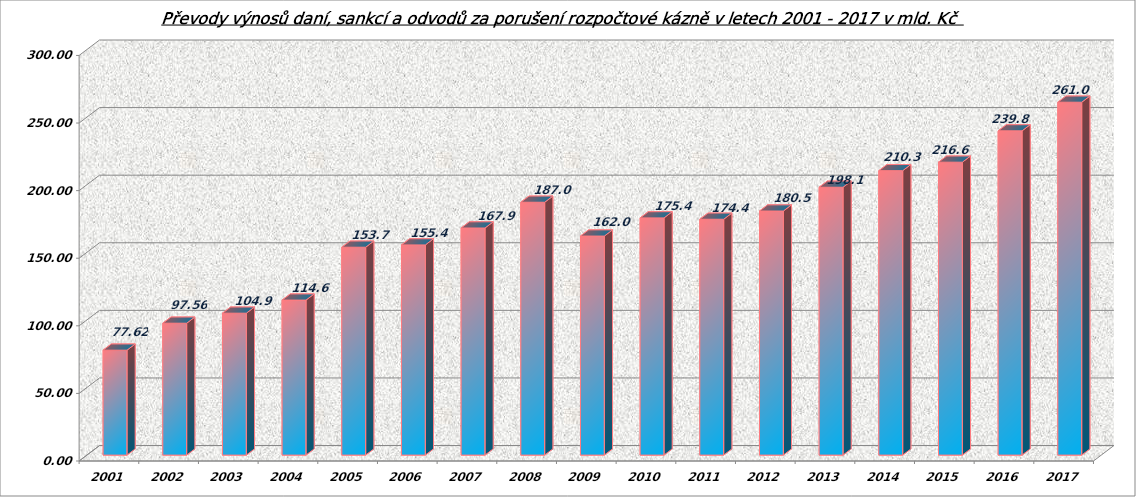
| Category | Series 0 |
|---|---|
| 2001.0 | 77.62 |
| 2002.0 | 97.559 |
| 2003.0 | 104.974 |
| 2004.0 | 114.659 |
| 2005.0 | 153.772 |
| 2006.0 | 155.476 |
| 2007.0 | 167.992 |
| 2008.0 | 187.032 |
| 2009.0 | 162.022 |
| 2010.0 | 175.47 |
| 2011.0 | 174.461 |
| 2012.0 | 180.539 |
| 2013.0 | 198.134 |
| 2014.0 | 210.384 |
| 2015.0 | 216.671 |
| 2016.0 | 239.846 |
| 2017.0 | 261.032 |